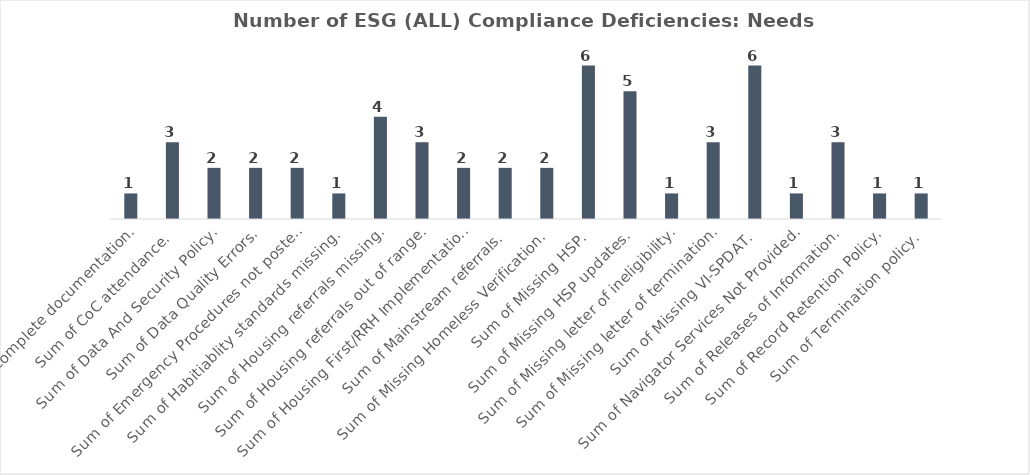
| Category | Total |
|---|---|
| Sum of Incomplete documentation. | 1 |
| Sum of CoC attendance. | 3 |
| Sum of Data And Security Policy. | 2 |
| Sum of Data Quality Errors. | 2 |
| Sum of Emergency Procedures not posted. | 2 |
| Sum of Habitiablity standards missing. | 1 |
| Sum of Housing referrals missing. | 4 |
| Sum of Housing referrals out of range. | 3 |
| Sum of Housing First/RRH Implementation. | 2 |
| Sum of Mainstream referrals. | 2 |
| Sum of Missing Homeless Verification. | 2 |
| Sum of Missing HSP. | 6 |
| Sum of Missing HSP updates. | 5 |
| Sum of Missing letter of ineligibility. | 1 |
| Sum of Missing letter of termination. | 3 |
| Sum of Missing VI-SPDAT. | 6 |
| Sum of Navigator Services Not Provided. | 1 |
| Sum of Releases of Information. | 3 |
| Sum of Record Retention Policy. | 1 |
| Sum of Termination policy. | 1 |